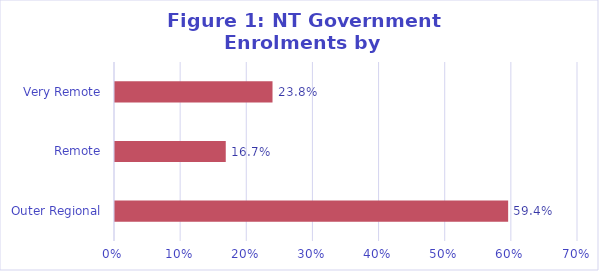
| Category | Series 0 |
|---|---|
| Outer Regional | 0.594 |
| Remote | 0.167 |
| Very Remote | 0.238 |